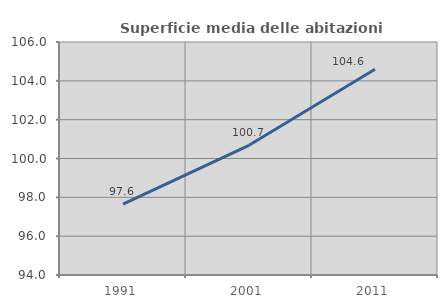
| Category | Superficie media delle abitazioni occupate |
|---|---|
| 1991.0 | 97.648 |
| 2001.0 | 100.681 |
| 2011.0 | 104.595 |